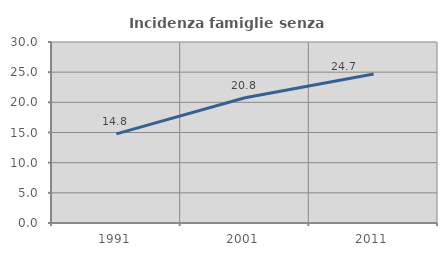
| Category | Incidenza famiglie senza nuclei |
|---|---|
| 1991.0 | 14.78 |
| 2001.0 | 20.764 |
| 2011.0 | 24.704 |